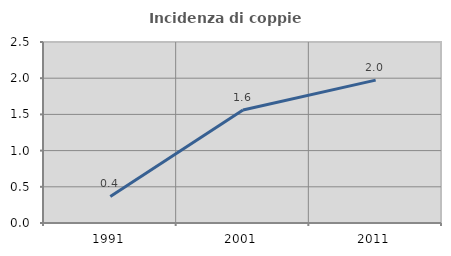
| Category | Incidenza di coppie miste |
|---|---|
| 1991.0 | 0.366 |
| 2001.0 | 1.56 |
| 2011.0 | 1.973 |